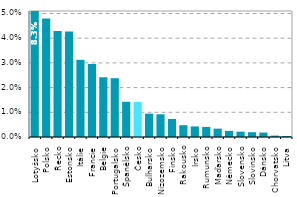
| Category | Series 0 |
|---|---|
| Lotyšsko | 0.083 |
| Polsko | 0.048 |
| Řecko | 0.043 |
| Estonsko | 0.043 |
| Itálie | 0.031 |
| Francie | 0.03 |
| Belgie | 0.024 |
| Portugalsko | 0.024 |
| Španělsko | 0.014 |
| Česko | 0.014 |
| Bulharsko | 0.009 |
| Nizozemsko | 0.009 |
| Finsko | 0.007 |
| Rakousko | 0.005 |
| Irsko | 0.004 |
| Rumunsko | 0.004 |
| Maďarsko | 0.003 |
| Německo | 0.002 |
| Slovensko | 0.002 |
| Slovinsko | 0.002 |
| Dánsko | 0.002 |
| Chorvatsko | 0.001 |
| Litva | 0 |